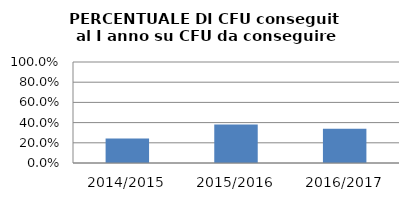
| Category | 2014/2015 2015/2016 2016/2017 |
|---|---|
| 2014/2015 | 0.243 |
| 2015/2016 | 0.382 |
| 2016/2017 | 0.338 |